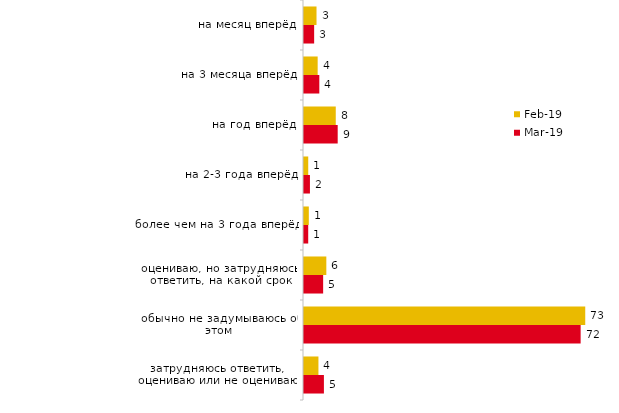
| Category | фев.19 | мар.19 |
|---|---|---|
| на месяц вперёд | 3.25 | 2.636 |
| на 3 месяца вперёд | 3.55 | 3.978 |
| на год вперёд | 8.25 | 8.752 |
| на 2-3 года вперёд | 1.1 | 1.542 |
| более чем на 3 года вперёд | 1.25 | 1.094 |
| оцениваю, но затрудняюсь ответить, на какой срок | 5.8 | 4.973 |
| обычно не задумываюсь об этом | 73.05 | 71.855 |
| затрудняюсь ответить, оцениваю или не оцениваю | 3.75 | 5.172 |